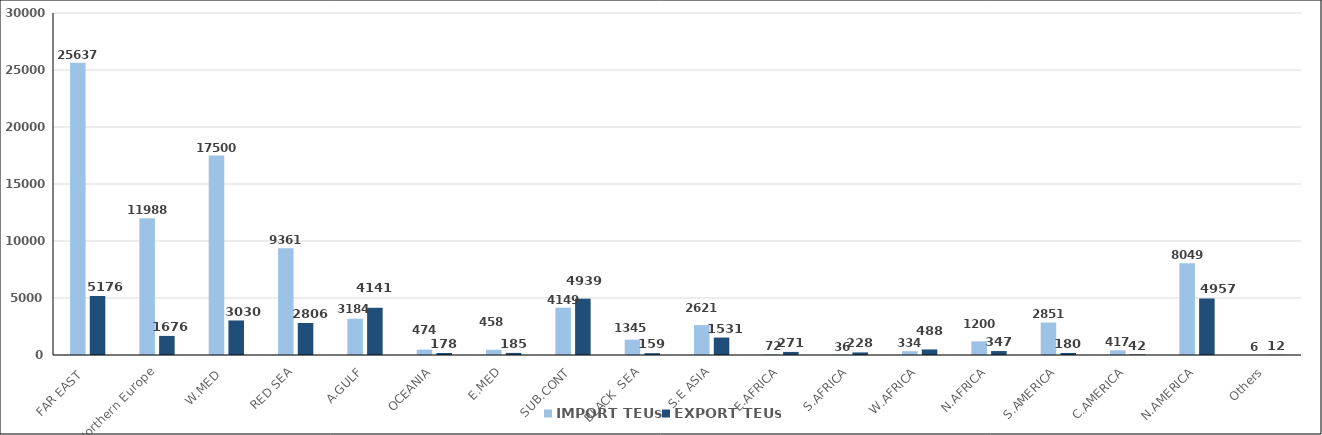
| Category | IMPORT TEUs | EXPORT TEUs |
|---|---|---|
| FAR EAST  | 25637 | 5176 |
| Northern Europe | 11988 | 1676 |
| W.MED  | 17500 | 3030 |
| RED SEA | 9361 | 2806 |
| A.GULF | 3184 | 4141 |
| OCEANIA | 474 | 178 |
| E.MED | 458 | 185 |
| SUB.CONT | 4149 | 4939 |
| BLACK  SEA | 1345 | 159 |
| S.E ASIA | 2621 | 1531 |
| E.AFRICA | 72 | 271 |
| S.AFRICA | 36 | 228 |
| W.AFRICA | 334 | 488 |
| N.AFRICA | 1200 | 347 |
| S.AMERICA | 2851 | 180 |
| C.AMERICA | 417 | 42 |
| N.AMERICA | 8049 | 4957 |
| Others | 6 | 12 |